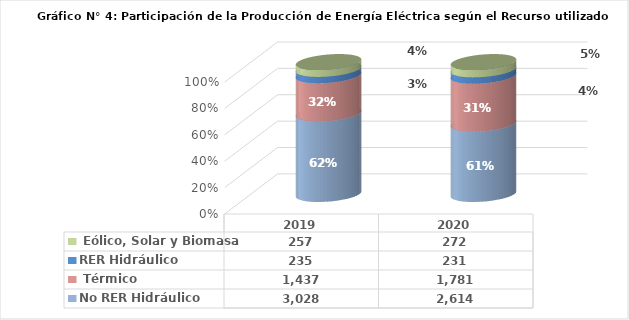
| Category | No RER | RER |
|---|---|---|
| 2019.0 | 1437.407 | 257.388 |
| 2020.0 | 1781.474 | 272.314 |